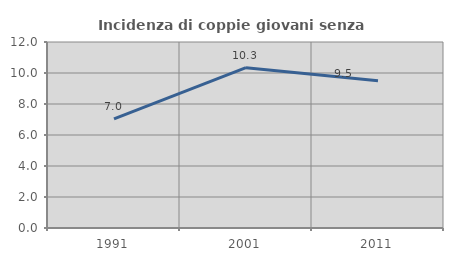
| Category | Incidenza di coppie giovani senza figli |
|---|---|
| 1991.0 | 7.035 |
| 2001.0 | 10.345 |
| 2011.0 | 9.495 |